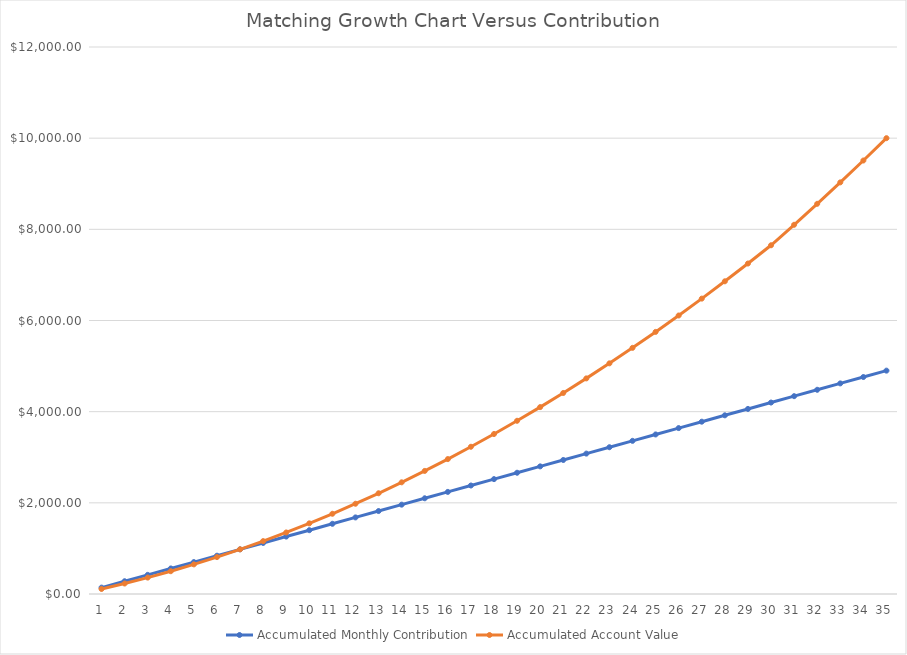
| Category | Accumulated Monthly Contribution | Accumulated Account Value |
|---|---|---|
| 0 | 140 | 110 |
| 1 | 280 | 230 |
| 2 | 420 | 360 |
| 3 | 560 | 500 |
| 4 | 700 | 650 |
| 5 | 840 | 810 |
| 6 | 980 | 980 |
| 7 | 1120 | 1160 |
| 8 | 1260 | 1350 |
| 9 | 1400 | 1550 |
| 10 | 1540 | 1760 |
| 11 | 1680 | 1980 |
| 12 | 1820 | 2210 |
| 13 | 1960 | 2450 |
| 14 | 2100 | 2700 |
| 15 | 2240 | 2960 |
| 16 | 2380 | 3230 |
| 17 | 2520 | 3510 |
| 18 | 2660 | 3800 |
| 19 | 2800 | 4100 |
| 20 | 2940 | 4410 |
| 21 | 3080 | 4730 |
| 22 | 3220 | 5060 |
| 23 | 3360 | 5400 |
| 24 | 3500 | 5750 |
| 25 | 3640 | 6110 |
| 26 | 3780 | 6480 |
| 27 | 3920 | 6860 |
| 28 | 4060 | 7250 |
| 29 | 4200 | 7650 |
| 30 | 4340 | 8100 |
| 31 | 4480 | 8560 |
| 32 | 4620 | 9030 |
| 33 | 4760 | 9510 |
| 34 | 4900 | 10000 |